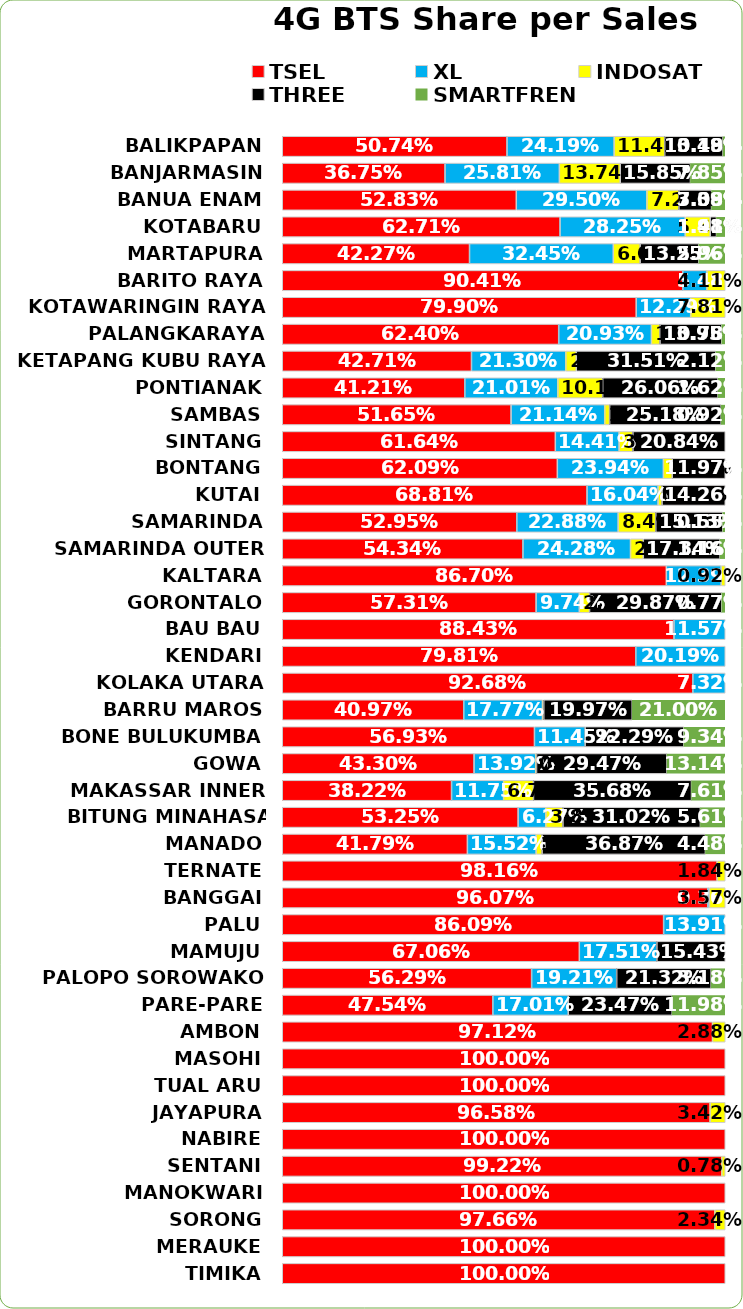
| Category | TSEL | XL | INDOSAT | THREE | SMARTFREN |
|---|---|---|---|---|---|
| BALIKPAPAN | 0.507 | 0.242 | 0.114 | 0.132 | 0.005 |
| BANJARMASIN | 0.367 | 0.258 | 0.137 | 0.158 | 0.079 |
| BANUA ENAM | 0.528 | 0.295 | 0.072 | 0.074 | 0.031 |
| KOTABARU | 0.627 | 0.282 | 0.056 | 0.014 | 0.02 |
| MARTAPURA | 0.423 | 0.325 | 0.061 | 0.132 | 0.06 |
| BARITO RAYA | 0.904 | 0.055 | 0.041 | 0 | 0 |
| KOTAWARINGIN RAYA | 0.799 | 0.123 | 0.078 | 0 | 0 |
| PALANGKARAYA | 0.624 | 0.209 | 0.019 | 0.14 | 0.008 |
| KETAPANG KUBU RAYA | 0.427 | 0.213 | 0.024 | 0.315 | 0.021 |
| PONTIANAK | 0.412 | 0.21 | 0.101 | 0.261 | 0.016 |
| SAMBAS | 0.517 | 0.211 | 0.011 | 0.252 | 0.009 |
| SINTANG | 0.616 | 0.144 | 0.031 | 0.208 | 0 |
| BONTANG | 0.621 | 0.239 | 0.02 | 0.12 | 0 |
| KUTAI | 0.688 | 0.16 | 0.009 | 0.143 | 0 |
| SAMARINDA | 0.53 | 0.229 | 0.085 | 0.151 | 0.006 |
| SAMARINDA OUTER | 0.543 | 0.243 | 0.029 | 0.173 | 0.012 |
| KALTARA | 0.867 | 0.124 | 0.009 | 0 | 0 |
| GORONTALO | 0.573 | 0.097 | 0.023 | 0.299 | 0.008 |
| BAU BAU | 0.884 | 0.116 | 0 | 0 | 0 |
| KENDARI | 0.798 | 0.202 | 0 | 0 | 0 |
| KOLAKA UTARA | 0.927 | 0.073 | 0 | 0 | 0 |
| BARRU MAROS | 0.41 | 0.178 | 0.003 | 0.2 | 0.21 |
| BONE BULUKUMBA | 0.569 | 0.114 | 0 | 0.223 | 0.093 |
| GOWA | 0.433 | 0.139 | 0.002 | 0.295 | 0.131 |
| MAKASSAR INNER | 0.382 | 0.117 | 0.067 | 0.357 | 0.076 |
| BITUNG MINAHASA TALAUD | 0.532 | 0.063 | 0.039 | 0.31 | 0.056 |
| MANADO | 0.418 | 0.155 | 0.013 | 0.369 | 0.045 |
| TERNATE | 0.982 | 0 | 0.018 | 0 | 0 |
| BANGGAI | 0.961 | 0.004 | 0.036 | 0 | 0 |
| PALU | 0.861 | 0.139 | 0 | 0 | 0 |
| MAMUJU | 0.671 | 0.175 | 0 | 0.154 | 0 |
| PALOPO SOROWAKO | 0.563 | 0.192 | 0 | 0.213 | 0.032 |
| PARE-PARE | 0.475 | 0.17 | 0 | 0.235 | 0.12 |
| AMBON | 0.971 | 0 | 0.029 | 0 | 0 |
| MASOHI | 1 | 0 | 0 | 0 | 0 |
| TUAL ARU | 1 | 0 | 0 | 0 | 0 |
| JAYAPURA | 0.966 | 0 | 0.034 | 0 | 0 |
| NABIRE | 1 | 0 | 0 | 0 | 0 |
| SENTANI | 0.992 | 0 | 0.008 | 0 | 0 |
| MANOKWARI | 1 | 0 | 0 | 0 | 0 |
| SORONG | 0.977 | 0 | 0.023 | 0 | 0 |
| MERAUKE | 1 | 0 | 0 | 0 | 0 |
| TIMIKA | 1 | 0 | 0 | 0 | 0 |